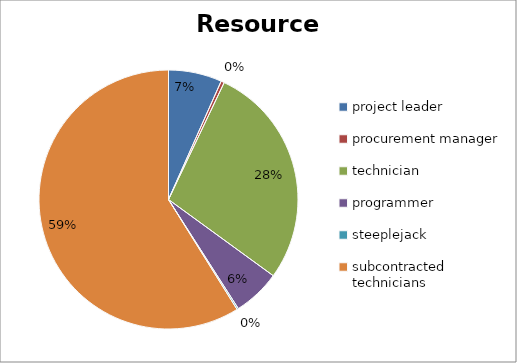
| Category | data |
|---|---|
| project leader | 7200 |
| procurement manager | 440 |
| technician | 30176 |
| programmer | 6400 |
| steeplejack | 200 |
| subcontracted technicians | 63590.398 |